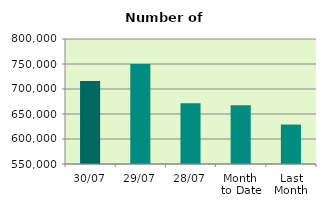
| Category | Series 0 |
|---|---|
| 30/07 | 715922 |
| 29/07 | 750124 |
| 28/07 | 671676 |
| Month 
to Date | 667427.091 |
| Last
Month | 628899 |